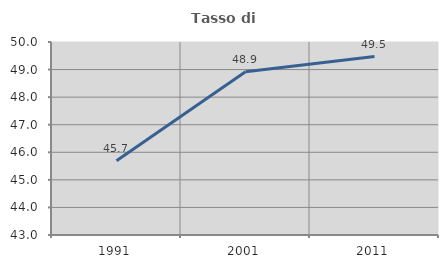
| Category | Tasso di occupazione   |
|---|---|
| 1991.0 | 45.691 |
| 2001.0 | 48.923 |
| 2011.0 | 49.473 |